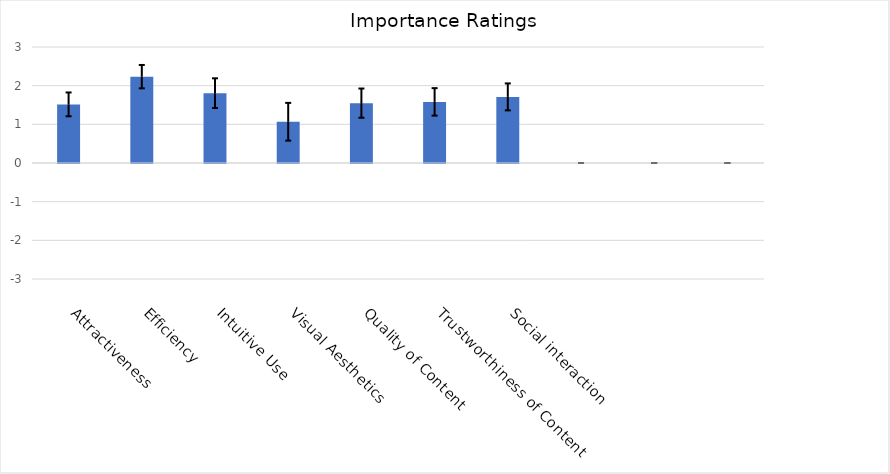
| Category | Series 0 |
|---|---|
| Attractiveness | 1.516 |
| Efficiency | 2.233 |
| Intuitive Use | 1.806 |
| Visual Aesthetics | 1.067 |
| Quality of Content | 1.548 |
| Trustworthiness of Content | 1.581 |
| Social interaction | 1.71 |